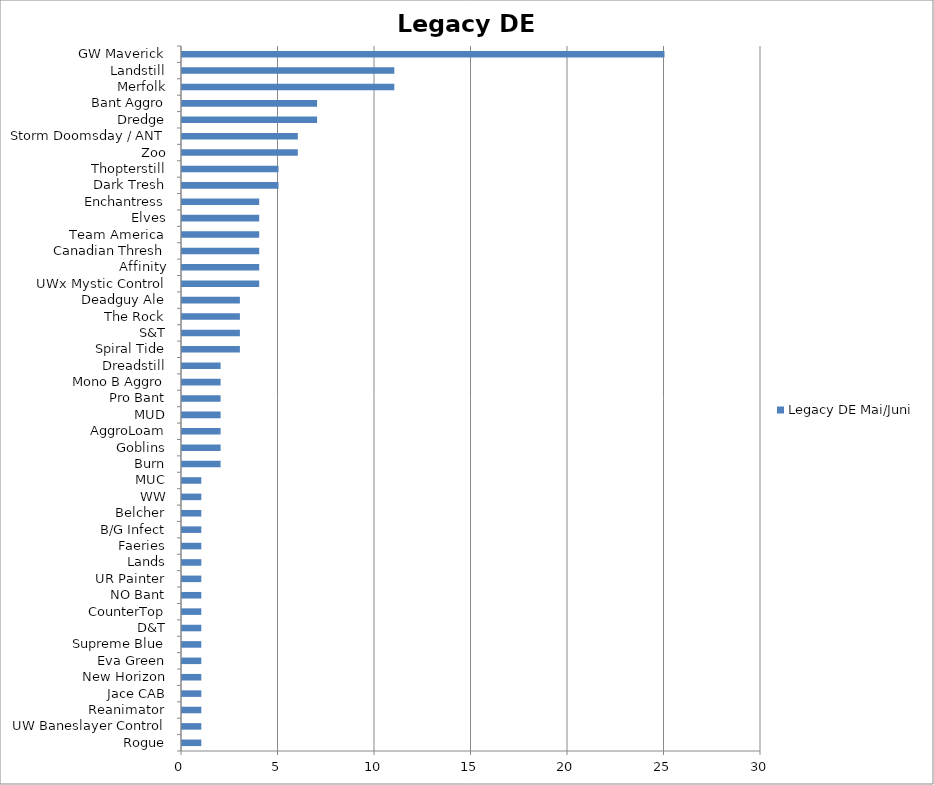
| Category | Legacy DE Mai/Juni |
|---|---|
| Rogue | 1 |
| UW Baneslayer Control | 1 |
| Reanimator | 1 |
| Jace CAB | 1 |
| New Horizon | 1 |
| Eva Green | 1 |
| Supreme Blue | 1 |
| D&T | 1 |
| CounterTop | 1 |
| NO Bant | 1 |
| UR Painter | 1 |
| Lands | 1 |
| Faeries | 1 |
| B/G Infect | 1 |
| Belcher | 1 |
| WW | 1 |
| MUC | 1 |
| Burn | 2 |
| Goblins | 2 |
| AggroLoam | 2 |
| MUD | 2 |
| Pro Bant | 2 |
| Mono B Aggro | 2 |
| Dreadstill | 2 |
| Spiral Tide | 3 |
| S&T | 3 |
| The Rock | 3 |
| Deadguy Ale | 3 |
| UWx Mystic Control | 4 |
| Affinity | 4 |
| Canadian Thresh | 4 |
| Team America | 4 |
| Elves | 4 |
| Enchantress | 4 |
| Dark Tresh | 5 |
| Thopterstill | 5 |
| Zoo | 6 |
| Storm Doomsday / ANT | 6 |
| Dredge | 7 |
| Bant Aggro | 7 |
| Merfolk | 11 |
| Landstill | 11 |
| GW Maverick | 25 |